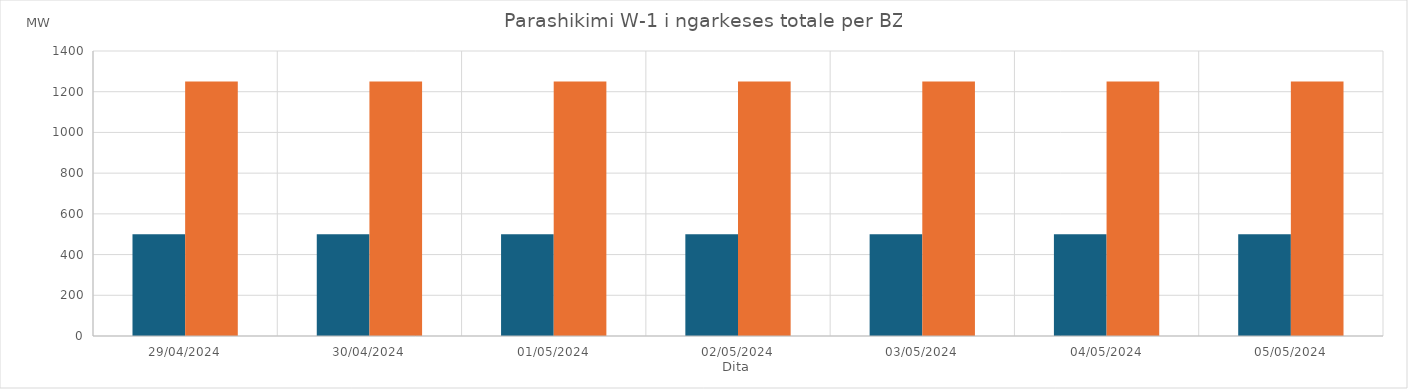
| Category | Min (MW) | Max (MW) |
|---|---|---|
| 29/04/2024 | 500 | 1250 |
| 30/04/2024 | 500 | 1250 |
| 01/05/2024 | 500 | 1250 |
| 02/05/2024 | 500 | 1250 |
| 03/05/2024 | 500 | 1250 |
| 04/05/2024 | 500 | 1250 |
| 05/05/2024 | 500 | 1250 |